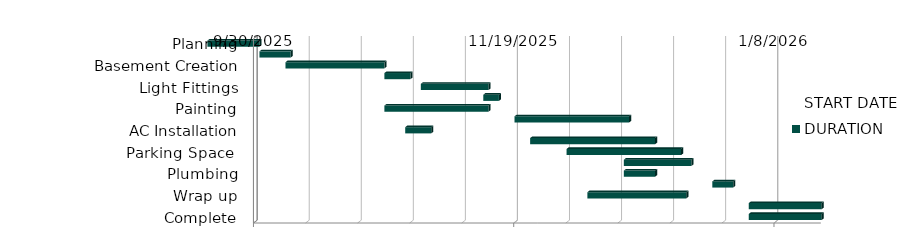
| Category | START DATE | DURATION |
|---|---|---|
| Planning | 9/21/25 | 10 |
| Raw Material Accumulation | 10/1/25 | 6 |
| Basement Creation | 10/6/25 | 19 |
| Floors Creation | 10/25/25 | 5 |
| Light Fittings | 11/1/25 | 13 |
| Sewage Pipelines | 11/13/25 | 3 |
| Painting | 10/25/25 | 20 |
| Accessories Installation | 11/19/25 | 22 |
| AC Installation | 10/29/25 | 5 |
| Fire Extingushers  | 11/22/25 | 24 |
| Parking Space  | 11/29/25 | 22 |
| Appliances | 12/10/25 | 13 |
| Plumbing | 12/10/25 | 6 |
| Final Inspections | 12/27/25 | 4 |
| Wrap up | 12/3/25 | 19 |
| House Cleaning | 1/3/26 | 21 |
| Complete | 1/3/26 | 15 |